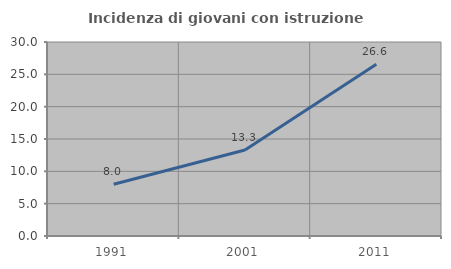
| Category | Incidenza di giovani con istruzione universitaria |
|---|---|
| 1991.0 | 8.009 |
| 2001.0 | 13.3 |
| 2011.0 | 26.558 |